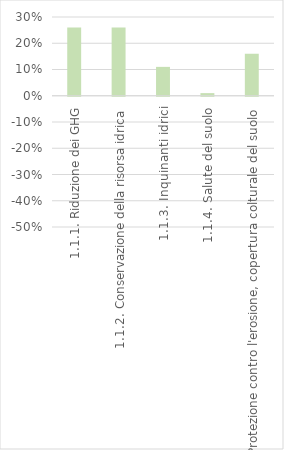
| Category | Series 0 |
|---|---|
| 1.1.1. Riduzione dei GHG | 0.26 |
| 1.1.2. Conservazione della risorsa idrica | 0.26 |
| 1.1.3. Inquinanti idrici | 0.11 |
| 1.1.4. Salute del suolo | 0.01 |
| 1.1.5. Protezione contro l'erosione, copertura colturale del suolo | 0.16 |